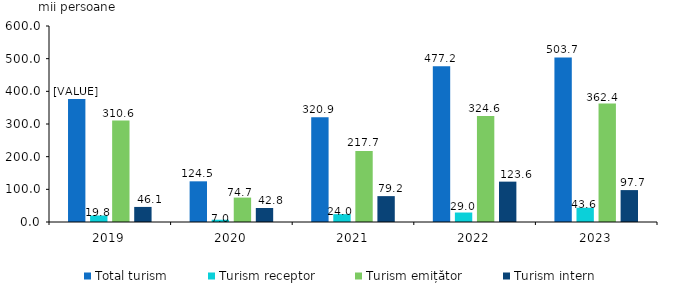
| Category | Total turism | Turism receptor | Turism emițător | Turism intern |
|---|---|---|---|---|
| 2019.0 | 376.625 | 19.848 | 310.649 | 46.128 |
| 2020.0 | 124.506 | 6.95 | 74.708 | 42.848 |
| 2021.0 | 320.88 | 24.006 | 217.678 | 79.196 |
| 2022.0 | 477.151 | 29.008 | 324.584 | 123.559 |
| 2023.0 | 503.699 | 43.597 | 362.44 | 97.662 |